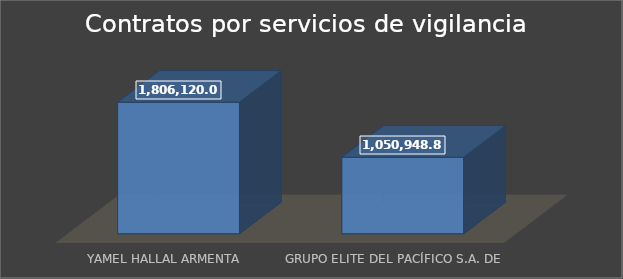
| Category | Total  |
|---|---|
| YAMEL HALLAL ARMENTA  | 1806120 |
| GRUPO ELITE DEL PACÍFICO S.A. DE C.V.  | 1050948.8 |